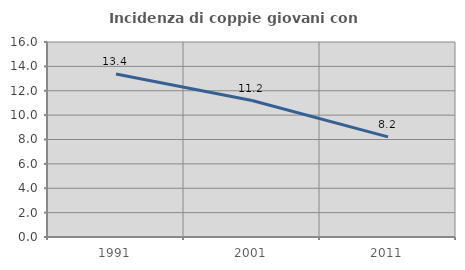
| Category | Incidenza di coppie giovani con figli |
|---|---|
| 1991.0 | 13.381 |
| 2001.0 | 11.198 |
| 2011.0 | 8.214 |